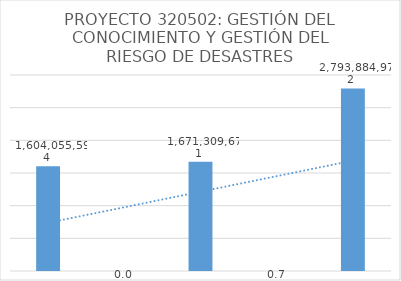
| Category | Series 0 |
|---|---|
| 0 | 1604055594 |
| 1 | 0.042 |
| 2 | 1671309670.654 |
| 3 | 0.672 |
| 4 | 2793884971.84 |